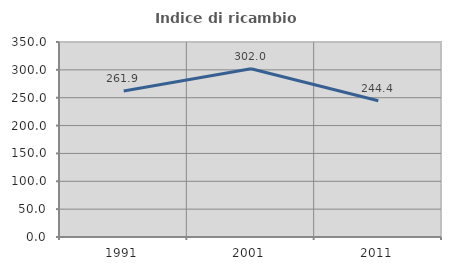
| Category | Indice di ricambio occupazionale  |
|---|---|
| 1991.0 | 261.905 |
| 2001.0 | 301.961 |
| 2011.0 | 244.444 |